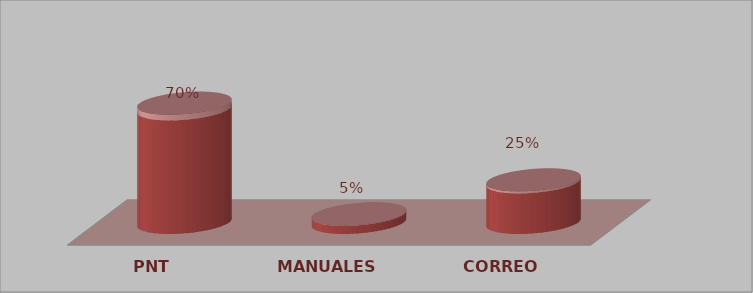
| Category | Series 0 | Series 1 |
|---|---|---|
| PNT | 14 | 0.7 |
| MANUALES | 1 | 0.05 |
| CORREO | 5 | 0.25 |